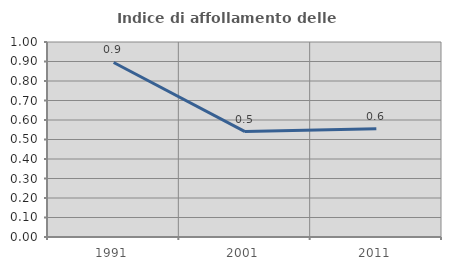
| Category | Indice di affollamento delle abitazioni  |
|---|---|
| 1991.0 | 0.895 |
| 2001.0 | 0.54 |
| 2011.0 | 0.555 |